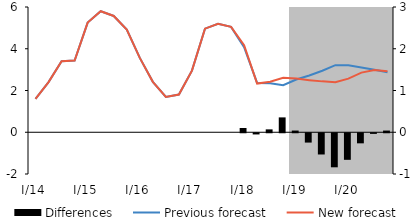
| Category | Differences |
|---|---|
| I/14 | 0 |
| II | 0 |
| III | 0 |
| IV | 0 |
| I/15 | 0 |
| II | 0 |
| III | 0 |
| IV | 0 |
| I/16 | 0 |
| II | 0 |
| III | 0 |
| IV | 0 |
| I/17 | 0 |
| II | 0 |
| III | 0 |
| IV | 0 |
| I/18 | 0.102 |
| II | -0.029 |
| III | 0.069 |
| IV | 0.356 |
| I/19 | 0.041 |
| II | -0.224 |
| III | -0.509 |
| IV | -0.816 |
| I/20 | -0.636 |
| II | -0.242 |
| III | -0.015 |
| IV | 0.04 |